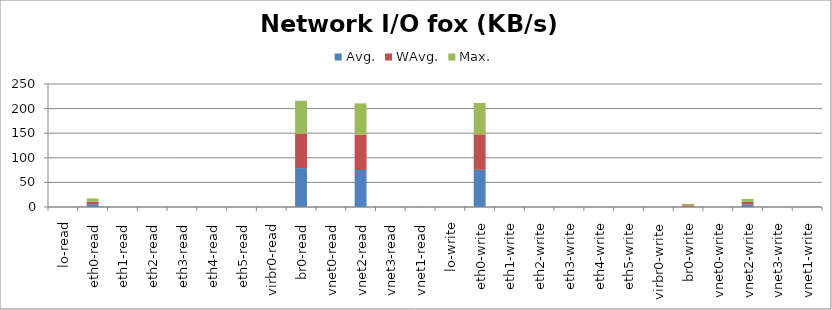
| Category | Avg. | WAvg. | Max. |
|---|---|---|---|
| lo-read | 0 | 0 | 0 |
| eth0-read | 5.762 | 5.114 | 6.424 |
| eth1-read | 0 | 0 | 0 |
| eth2-read | 0 | 0 | 0 |
| eth3-read | 0 | 0 | 0 |
| eth4-read | 0 | 0 | 0 |
| eth5-read | 0 | 0 | 0 |
| virbr0-read | 0 | 0 | 0 |
| br0-read | 79.108 | 70.068 | 66.823 |
| vnet0-read | 0 | 0 | 0 |
| vnet2-read | 75.13 | 72.064 | 63.406 |
| vnet3-read | 0 | 0 | 0 |
| vnet1-read | 0.002 | 0.098 | 0 |
| lo-write | 0 | 0 | 0 |
| eth0-write | 75.577 | 72.096 | 63.927 |
| eth1-write | 0 | 0 | 0 |
| eth2-write | 0 | 0 | 0 |
| eth3-write | 0 | 0 | 0 |
| eth4-write | 0 | 0 | 0 |
| eth5-write | 0 | 0 | 0 |
| virbr0-write | 0 | 0 | 0 |
| br0-write | 0.225 | 3.195 | 2.98 |
| vnet0-write | 0.098 | 0.002 | 0 |
| vnet2-write | 5.345 | 5.29 | 5.765 |
| vnet3-write | 0.098 | 0.002 | 0 |
| vnet1-write | 0.102 | 0.008 | 0.19 |